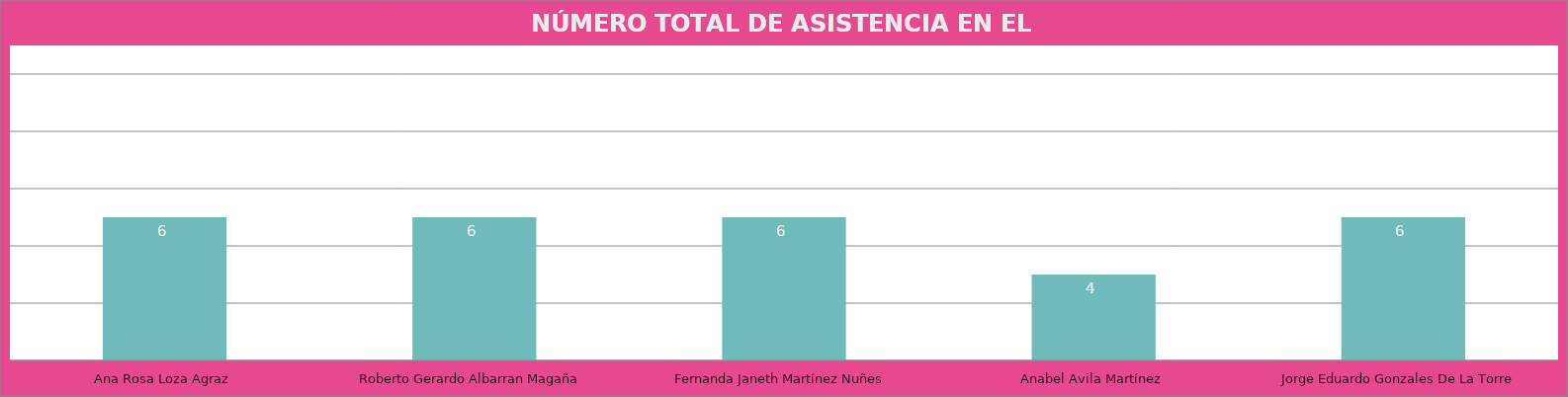
| Category | Ana Rosa Loza Agraz Roberto Gerardo Albarran Magaña Fernanda Janeth Martínez Nuñes Anabel Avila Martínez Jorge Eduardo Gonzales De La Torre |
|---|---|
| Ana Rosa Loza Agraz | 6 |
| Roberto Gerardo Albarran Magaña | 6 |
| Fernanda Janeth Martínez Nuñes | 6 |
| Anabel Avila Martínez | 4 |
| Jorge Eduardo Gonzales De La Torre | 6 |